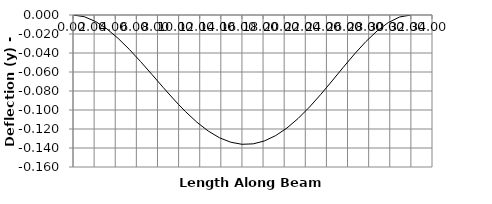
| Category | y |
|---|---|
| 0.0 | 0 |
| 0.0 | 0 |
| 1.0666666666666667 | -0.002 |
| 2.1333333333333333 | -0.007 |
| 3.2 | -0.015 |
| 4.266666666666667 | -0.025 |
| 5.333333333333333 | -0.036 |
| 6.4 | -0.049 |
| 7.466666666666667 | -0.063 |
| 8.533333333333333 | -0.076 |
| 9.6 | -0.089 |
| 10.0 | -0.094 |
| 10.666666666666666 | -0.102 |
| 11.733333333333333 | -0.113 |
| 12.8 | -0.122 |
| 13.866666666666667 | -0.129 |
| 14.933333333333334 | -0.134 |
| 16.0 | -0.136 |
| 17.066666666666666 | -0.136 |
| 18.133333333333333 | -0.133 |
| 19.2 | -0.127 |
| 20.266666666666666 | -0.119 |
| 21.333333333333332 | -0.109 |
| 22.4 | -0.097 |
| 23.466666666666665 | -0.084 |
| 24.53333333333333 | -0.069 |
| 25.0 | -0.063 |
| 25.6 | -0.055 |
| 26.666666666666668 | -0.041 |
| 27.733333333333334 | -0.028 |
| 28.8 | -0.017 |
| 29.866666666666667 | -0.008 |
| 30.933333333333334 | -0.002 |
| 32.0 | 0 |